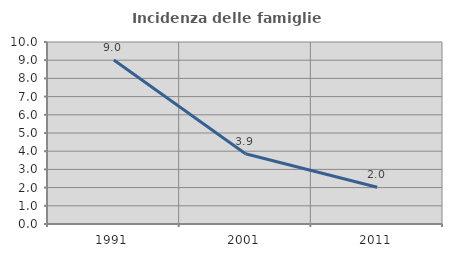
| Category | Incidenza delle famiglie numerose |
|---|---|
| 1991.0 | 9.01 |
| 2001.0 | 3.859 |
| 2011.0 | 2.018 |